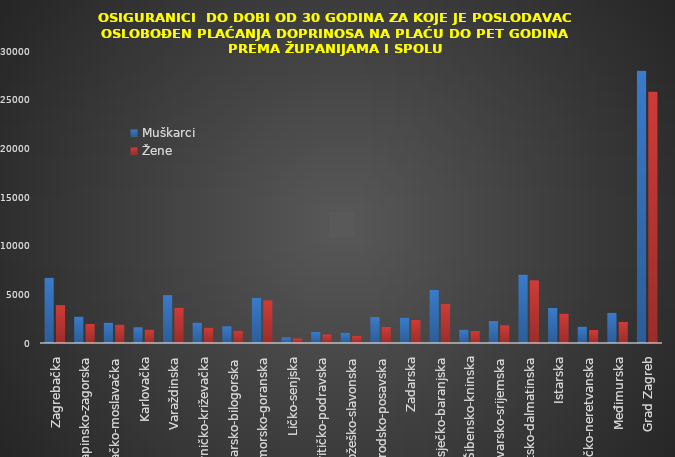
| Category | Muškarci | Žene |
|---|---|---|
| Zagrebačka | 6692 | 3885 |
| Krapinsko-zagorska | 2708 | 1953 |
| Sisačko-moslavačka | 2086 | 1890 |
| Karlovačka | 1614 | 1363 |
| Varaždinska | 4920 | 3637 |
| Koprivničko-križevačka | 2091 | 1576 |
| Bjelovarsko-bilogorska | 1710 | 1274 |
| Primorsko-goranska | 4633 | 4376 |
| Ličko-senjska | 584 | 470 |
| Virovitičko-podravska | 1139 | 879 |
| Požeško-slavonska | 1062 | 738 |
| Brodsko-posavska | 2665 | 1653 |
| Zadarska | 2595 | 2365 |
| Osječko-baranjska | 5463 | 4034 |
| Šibensko-kninska | 1367 | 1219 |
| Vukovarsko-srijemska | 2249 | 1815 |
| Splitsko-dalmatinska | 7021 | 6440 |
| Istarska | 3594 | 3015 |
| Dubrovačko-neretvanska | 1680 | 1332 |
| Međimurska | 3099 | 2168 |
| Grad Zagreb | 27968 | 25801 |